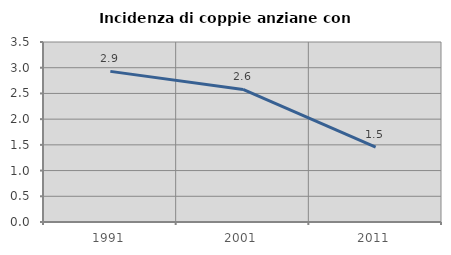
| Category | Incidenza di coppie anziane con figli |
|---|---|
| 1991.0 | 2.929 |
| 2001.0 | 2.577 |
| 2011.0 | 1.456 |